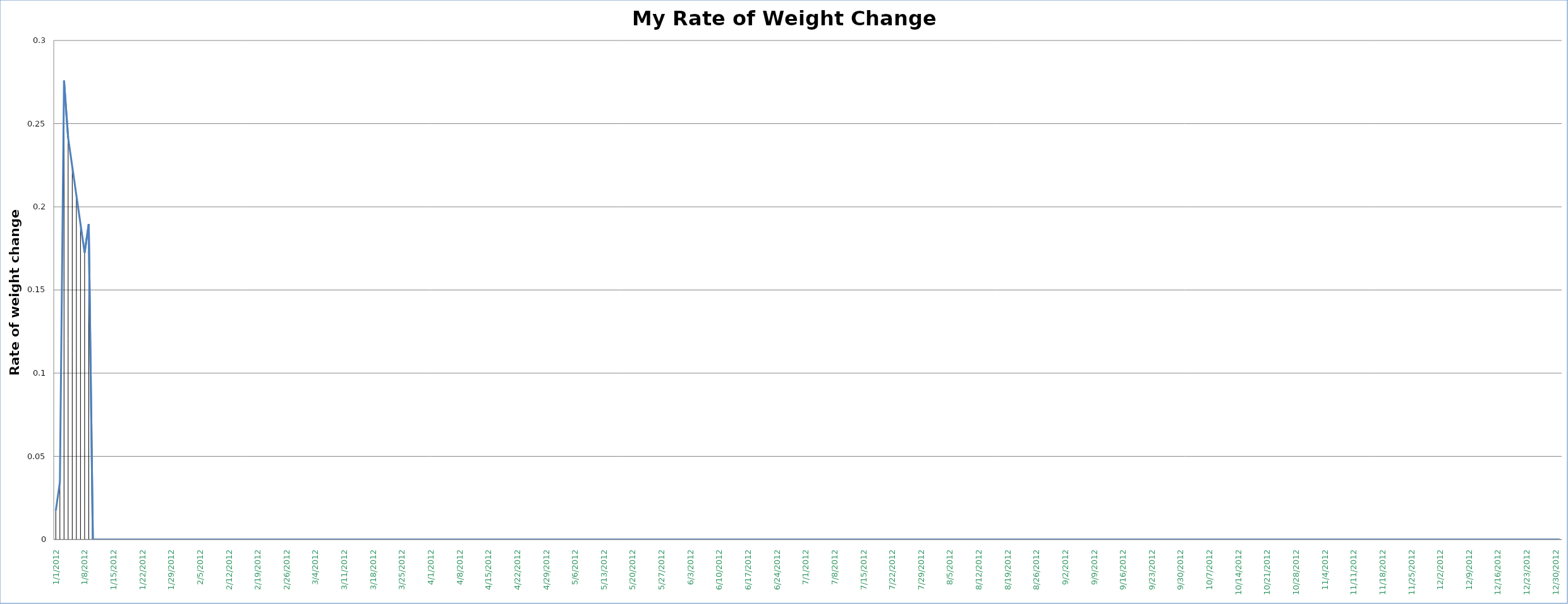
| Category | Rate of Change per day |
|---|---|
| 1/1/12 | 0.017 |
| 1/2/12 | 0.034 |
| 1/3/12 | 0.276 |
| 1/4/12 | 0.241 |
| 1/5/12 | 0.224 |
| 1/6/12 | 0.207 |
| 1/7/12 | 0.19 |
| 1/8/12 | 0.172 |
| 1/9/12 | 0.19 |
| 1/10/12 | 0 |
| 1/11/12 | 0 |
| 1/12/12 | 0 |
| 1/13/12 | 0 |
| 1/14/12 | 0 |
| 1/15/12 | 0 |
| 1/16/12 | 0 |
| 1/17/12 | 0 |
| 1/18/12 | 0 |
| 1/19/12 | 0 |
| 1/20/12 | 0 |
| 1/21/12 | 0 |
| 1/22/12 | 0 |
| 1/23/12 | 0 |
| 1/24/12 | 0 |
| 1/25/12 | 0 |
| 1/26/12 | 0 |
| 1/27/12 | 0 |
| 1/28/12 | 0 |
| 1/29/12 | 0 |
| 1/30/12 | 0 |
| 1/31/12 | 0 |
| 2/1/12 | 0 |
| 2/2/12 | 0 |
| 2/3/12 | 0 |
| 2/4/12 | 0 |
| 2/5/12 | 0 |
| 2/6/12 | 0 |
| 2/7/12 | 0 |
| 2/8/12 | 0 |
| 2/9/12 | 0 |
| 2/10/12 | 0 |
| 2/11/12 | 0 |
| 2/12/12 | 0 |
| 2/13/12 | 0 |
| 2/14/12 | 0 |
| 2/15/12 | 0 |
| 2/16/12 | 0 |
| 2/17/12 | 0 |
| 2/18/12 | 0 |
| 2/19/12 | 0 |
| 2/20/12 | 0 |
| 2/21/12 | 0 |
| 2/22/12 | 0 |
| 2/23/12 | 0 |
| 2/24/12 | 0 |
| 2/25/12 | 0 |
| 2/26/12 | 0 |
| 2/27/12 | 0 |
| 2/28/12 | 0 |
| 2/29/12 | 0 |
| 3/1/12 | 0 |
| 3/2/12 | 0 |
| 3/3/12 | 0 |
| 3/4/12 | 0 |
| 3/5/12 | 0 |
| 3/6/12 | 0 |
| 3/7/12 | 0 |
| 3/8/12 | 0 |
| 3/9/12 | 0 |
| 3/10/12 | 0 |
| 3/11/12 | 0 |
| 3/12/12 | 0 |
| 3/13/12 | 0 |
| 3/14/12 | 0 |
| 3/15/12 | 0 |
| 3/16/12 | 0 |
| 3/17/12 | 0 |
| 3/18/12 | 0 |
| 3/19/12 | 0 |
| 3/20/12 | 0 |
| 3/21/12 | 0 |
| 3/22/12 | 0 |
| 3/23/12 | 0 |
| 3/24/12 | 0 |
| 3/25/12 | 0 |
| 3/26/12 | 0 |
| 3/27/12 | 0 |
| 3/28/12 | 0 |
| 3/29/12 | 0 |
| 3/30/12 | 0 |
| 3/31/12 | 0 |
| 4/1/12 | 0 |
| 4/2/12 | 0 |
| 4/3/12 | 0 |
| 4/4/12 | 0 |
| 4/5/12 | 0 |
| 4/6/12 | 0 |
| 4/7/12 | 0 |
| 4/8/12 | 0 |
| 4/9/12 | 0 |
| 4/10/12 | 0 |
| 4/11/12 | 0 |
| 4/12/12 | 0 |
| 4/13/12 | 0 |
| 4/14/12 | 0 |
| 4/15/12 | 0 |
| 4/16/12 | 0 |
| 4/17/12 | 0 |
| 4/18/12 | 0 |
| 4/19/12 | 0 |
| 4/20/12 | 0 |
| 4/21/12 | 0 |
| 4/22/12 | 0 |
| 4/23/12 | 0 |
| 4/24/12 | 0 |
| 4/25/12 | 0 |
| 4/26/12 | 0 |
| 4/27/12 | 0 |
| 4/28/12 | 0 |
| 4/29/12 | 0 |
| 4/30/12 | 0 |
| 5/1/12 | 0 |
| 5/2/12 | 0 |
| 5/3/12 | 0 |
| 5/4/12 | 0 |
| 5/5/12 | 0 |
| 5/6/12 | 0 |
| 5/7/12 | 0 |
| 5/8/12 | 0 |
| 5/9/12 | 0 |
| 5/10/12 | 0 |
| 5/11/12 | 0 |
| 5/12/12 | 0 |
| 5/13/12 | 0 |
| 5/14/12 | 0 |
| 5/15/12 | 0 |
| 5/16/12 | 0 |
| 5/17/12 | 0 |
| 5/18/12 | 0 |
| 5/19/12 | 0 |
| 5/20/12 | 0 |
| 5/21/12 | 0 |
| 5/22/12 | 0 |
| 5/23/12 | 0 |
| 5/24/12 | 0 |
| 5/25/12 | 0 |
| 5/26/12 | 0 |
| 5/27/12 | 0 |
| 5/28/12 | 0 |
| 5/29/12 | 0 |
| 5/30/12 | 0 |
| 5/31/12 | 0 |
| 6/1/12 | 0 |
| 6/2/12 | 0 |
| 6/3/12 | 0 |
| 6/4/12 | 0 |
| 6/5/12 | 0 |
| 6/6/12 | 0 |
| 6/7/12 | 0 |
| 6/8/12 | 0 |
| 6/9/12 | 0 |
| 6/10/12 | 0 |
| 6/11/12 | 0 |
| 6/12/12 | 0 |
| 6/13/12 | 0 |
| 6/14/12 | 0 |
| 6/15/12 | 0 |
| 6/16/12 | 0 |
| 6/17/12 | 0 |
| 6/18/12 | 0 |
| 6/19/12 | 0 |
| 6/20/12 | 0 |
| 6/21/12 | 0 |
| 6/22/12 | 0 |
| 6/23/12 | 0 |
| 6/24/12 | 0 |
| 6/25/12 | 0 |
| 6/26/12 | 0 |
| 6/27/12 | 0 |
| 6/28/12 | 0 |
| 6/29/12 | 0 |
| 6/30/12 | 0 |
| 7/1/12 | 0 |
| 7/2/12 | 0 |
| 7/3/12 | 0 |
| 7/4/12 | 0 |
| 7/5/12 | 0 |
| 7/6/12 | 0 |
| 7/7/12 | 0 |
| 7/8/12 | 0 |
| 7/9/12 | 0 |
| 7/10/12 | 0 |
| 7/11/12 | 0 |
| 7/12/12 | 0 |
| 7/13/12 | 0 |
| 7/14/12 | 0 |
| 7/15/12 | 0 |
| 7/16/12 | 0 |
| 7/17/12 | 0 |
| 7/18/12 | 0 |
| 7/19/12 | 0 |
| 7/20/12 | 0 |
| 7/21/12 | 0 |
| 7/22/12 | 0 |
| 7/23/12 | 0 |
| 7/24/12 | 0 |
| 7/25/12 | 0 |
| 7/26/12 | 0 |
| 7/27/12 | 0 |
| 7/28/12 | 0 |
| 7/29/12 | 0 |
| 7/30/12 | 0 |
| 7/31/12 | 0 |
| 8/1/12 | 0 |
| 8/2/12 | 0 |
| 8/3/12 | 0 |
| 8/4/12 | 0 |
| 8/5/12 | 0 |
| 8/6/12 | 0 |
| 8/7/12 | 0 |
| 8/8/12 | 0 |
| 8/9/12 | 0 |
| 8/10/12 | 0 |
| 8/11/12 | 0 |
| 8/12/12 | 0 |
| 8/13/12 | 0 |
| 8/14/12 | 0 |
| 8/15/12 | 0 |
| 8/16/12 | 0 |
| 8/17/12 | 0 |
| 8/18/12 | 0 |
| 8/19/12 | 0 |
| 8/20/12 | 0 |
| 8/21/12 | 0 |
| 8/22/12 | 0 |
| 8/23/12 | 0 |
| 8/24/12 | 0 |
| 8/25/12 | 0 |
| 8/26/12 | 0 |
| 8/27/12 | 0 |
| 8/28/12 | 0 |
| 8/29/12 | 0 |
| 8/30/12 | 0 |
| 8/31/12 | 0 |
| 9/1/12 | 0 |
| 9/2/12 | 0 |
| 9/3/12 | 0 |
| 9/4/12 | 0 |
| 9/5/12 | 0 |
| 9/6/12 | 0 |
| 9/7/12 | 0 |
| 9/8/12 | 0 |
| 9/9/12 | 0 |
| 9/10/12 | 0 |
| 9/11/12 | 0 |
| 9/12/12 | 0 |
| 9/13/12 | 0 |
| 9/14/12 | 0 |
| 9/15/12 | 0 |
| 9/16/12 | 0 |
| 9/17/12 | 0 |
| 9/18/12 | 0 |
| 9/19/12 | 0 |
| 9/20/12 | 0 |
| 9/21/12 | 0 |
| 9/22/12 | 0 |
| 9/23/12 | 0 |
| 9/24/12 | 0 |
| 9/25/12 | 0 |
| 9/26/12 | 0 |
| 9/27/12 | 0 |
| 9/28/12 | 0 |
| 9/29/12 | 0 |
| 9/30/12 | 0 |
| 10/1/12 | 0 |
| 10/2/12 | 0 |
| 10/3/12 | 0 |
| 10/4/12 | 0 |
| 10/5/12 | 0 |
| 10/6/12 | 0 |
| 10/7/12 | 0 |
| 10/8/12 | 0 |
| 10/9/12 | 0 |
| 10/10/12 | 0 |
| 10/11/12 | 0 |
| 10/12/12 | 0 |
| 10/13/12 | 0 |
| 10/14/12 | 0 |
| 10/15/12 | 0 |
| 10/16/12 | 0 |
| 10/17/12 | 0 |
| 10/18/12 | 0 |
| 10/19/12 | 0 |
| 10/20/12 | 0 |
| 10/21/12 | 0 |
| 10/22/12 | 0 |
| 10/23/12 | 0 |
| 10/24/12 | 0 |
| 10/25/12 | 0 |
| 10/26/12 | 0 |
| 10/27/12 | 0 |
| 10/28/12 | 0 |
| 10/29/12 | 0 |
| 10/30/12 | 0 |
| 10/31/12 | 0 |
| 11/1/12 | 0 |
| 11/2/12 | 0 |
| 11/3/12 | 0 |
| 11/4/12 | 0 |
| 11/5/12 | 0 |
| 11/6/12 | 0 |
| 11/7/12 | 0 |
| 11/8/12 | 0 |
| 11/9/12 | 0 |
| 11/10/12 | 0 |
| 11/11/12 | 0 |
| 11/12/12 | 0 |
| 11/13/12 | 0 |
| 11/14/12 | 0 |
| 11/15/12 | 0 |
| 11/16/12 | 0 |
| 11/17/12 | 0 |
| 11/18/12 | 0 |
| 11/19/12 | 0 |
| 11/20/12 | 0 |
| 11/21/12 | 0 |
| 11/22/12 | 0 |
| 11/23/12 | 0 |
| 11/24/12 | 0 |
| 11/25/12 | 0 |
| 11/26/12 | 0 |
| 11/27/12 | 0 |
| 11/28/12 | 0 |
| 11/29/12 | 0 |
| 11/30/12 | 0 |
| 12/1/12 | 0 |
| 12/2/12 | 0 |
| 12/3/12 | 0 |
| 12/4/12 | 0 |
| 12/5/12 | 0 |
| 12/6/12 | 0 |
| 12/7/12 | 0 |
| 12/8/12 | 0 |
| 12/9/12 | 0 |
| 12/10/12 | 0 |
| 12/11/12 | 0 |
| 12/12/12 | 0 |
| 12/13/12 | 0 |
| 12/14/12 | 0 |
| 12/15/12 | 0 |
| 12/16/12 | 0 |
| 12/17/12 | 0 |
| 12/18/12 | 0 |
| 12/19/12 | 0 |
| 12/20/12 | 0 |
| 12/21/12 | 0 |
| 12/22/12 | 0 |
| 12/23/12 | 0 |
| 12/24/12 | 0 |
| 12/25/12 | 0 |
| 12/26/12 | 0 |
| 12/27/12 | 0 |
| 12/28/12 | 0 |
| 12/29/12 | 0 |
| 12/30/12 | 0 |
| 12/31/12 | 0 |